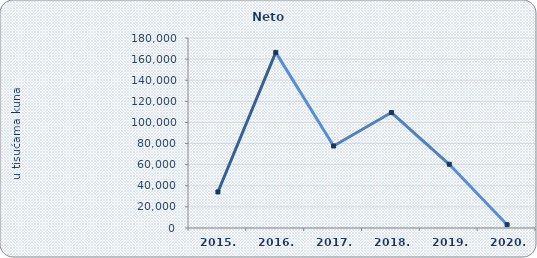
| Category | Neto dobit/gubitak |
|---|---|
| 2015. | 34125 |
| 2016. | 166389 |
| 2017. | 77699 |
| 2018. | 109352 |
| 2019. | 60380 |
| 2020. | 3094.704 |